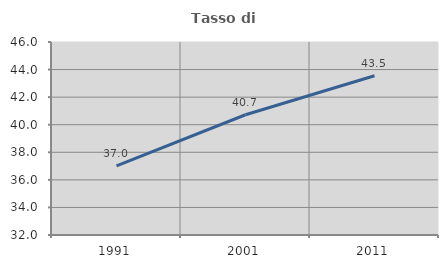
| Category | Tasso di occupazione   |
|---|---|
| 1991.0 | 37.02 |
| 2001.0 | 40.723 |
| 2011.0 | 43.549 |